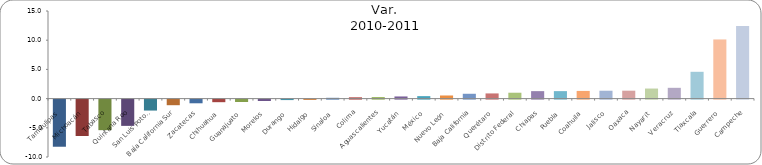
| Category | Var.
 2010-2011 |
|---|---|
| Tamaulipas | -8.071 |
| Michoacán | -6.23 |
| Tabasco | -5.233 |
| Quintana Roo | -4.499 |
| San Luis Potosí | -1.877 |
| Baja California Sur | -0.96 |
| Zacatecas | -0.631 |
| Chihuahua | -0.443 |
| Guanajuato | -0.411 |
| Morelos | -0.243 |
| Durango | -0.082 |
| Hidalgo | -0.054 |
| Sinaloa | 0.134 |
| Colima | 0.221 |
| Aguascalientes | 0.255 |
| Yucatán | 0.366 |
| México | 0.422 |
| Nuevo León | 0.534 |
| Baja California | 0.826 |
| Querétaro | 0.885 |
| Distrito Federal | 1.007 |
| Chiapas | 1.277 |
| Puebla | 1.279 |
| Coahuila | 1.314 |
| Jalisco | 1.348 |
| Oaxaca | 1.356 |
| Nayarit | 1.72 |
| Veracruz | 1.845 |
| Tlaxcala | 4.589 |
| Guerrero | 10.129 |
| Campeche | 12.417 |